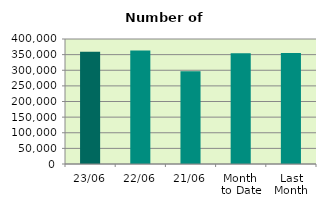
| Category | Series 0 |
|---|---|
| 23/06 | 359244 |
| 22/06 | 363002 |
| 21/06 | 297088 |
| Month 
to Date | 354163.375 |
| Last
Month | 355289.273 |